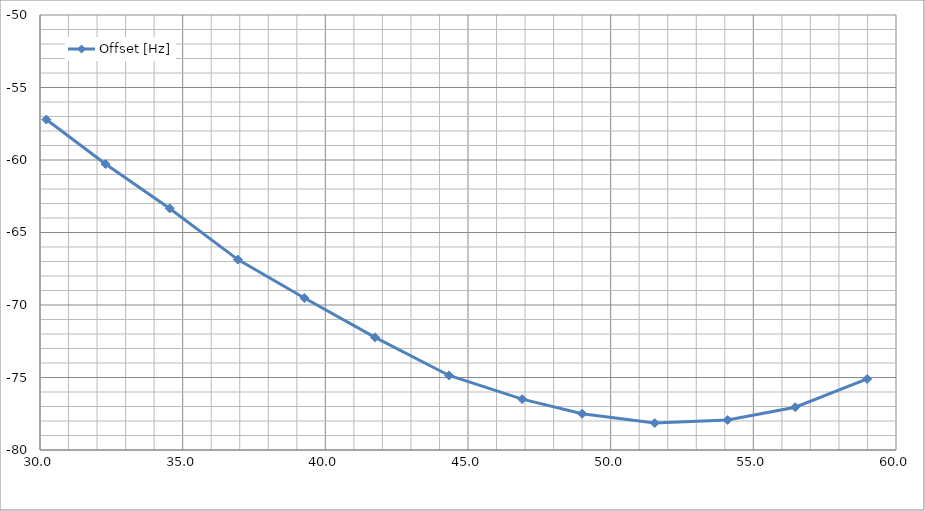
| Category | Offset [Hz] |
|---|---|
| 30.222000000000005 | -57.21 |
| 32.295399999999994 | -60.28 |
| 34.5472 | -63.34 |
| 36.9352 | -66.87 |
| 39.265499999999996 | -69.52 |
| 41.7421 | -72.23 |
| 44.337199999999996 | -74.86 |
| 46.8979 | -76.49 |
| 49.001799999999996 | -77.5 |
| 51.54430000000001 | -78.14 |
| 54.0996 | -77.93 |
| 56.46869999999999 | -77.05 |
| 58.990199999999994 | -75.1 |